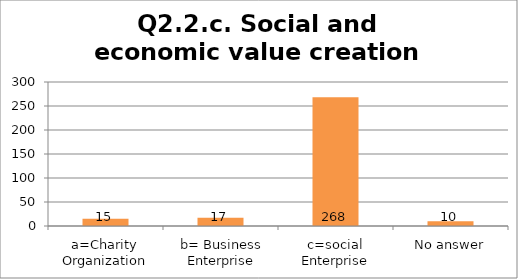
| Category | Q2.2.c. Social and economic value creation |
|---|---|
| a=Charity Organization | 15 |
| b= Business Enterprise | 17 |
| c=social Enterprise | 268 |
| No answer | 10 |